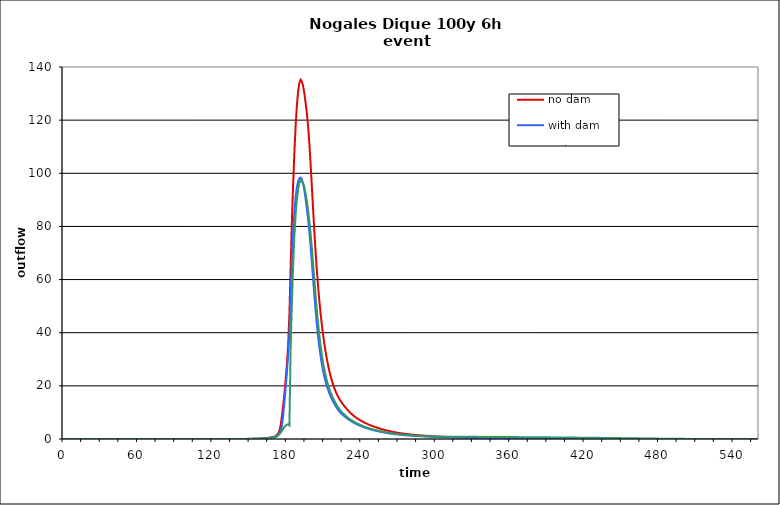
| Category | no dam | with dam | with dam/pond |
|---|---|---|---|
| 0.0 | 0 | 0 | 0 |
| 1.0 | 0 | 0 | 0 |
| 2.0 | 0 | 0 | 0 |
| 3.0 | 0 | 0 | 0 |
| 4.0 | 0 | 0 | 0 |
| 5.0 | 0 | 0 | 0 |
| 6.0 | 0 | 0 | 0 |
| 7.0 | 0 | 0 | 0 |
| 8.0 | 0 | 0 | 0 |
| 9.0 | 0 | 0 | 0 |
| 10.0 | 0 | 0 | 0 |
| 11.0 | 0 | 0 | 0 |
| 12.0 | 0 | 0 | 0 |
| 13.0 | 0 | 0 | 0 |
| 14.0 | 0 | 0 | 0 |
| 15.0 | 0 | 0 | 0 |
| 16.0 | 0 | 0 | 0 |
| 17.0 | 0 | 0 | 0 |
| 18.0 | 0 | 0 | 0 |
| 19.0 | 0 | 0 | 0 |
| 20.0 | 0 | 0 | 0 |
| 21.0 | 0 | 0 | 0 |
| 22.0 | 0 | 0 | 0 |
| 23.0 | 0 | 0 | 0 |
| 24.0 | 0 | 0 | 0 |
| 25.0 | 0 | 0 | 0 |
| 26.0 | 0 | 0 | 0 |
| 27.0 | 0 | 0 | 0 |
| 28.0 | 0 | 0 | 0 |
| 29.0 | 0 | 0 | 0 |
| 30.0 | 0 | 0 | 0 |
| 31.0 | 0 | 0 | 0 |
| 32.0 | 0 | 0 | 0 |
| 33.0 | 0 | 0 | 0 |
| 34.0 | 0 | 0 | 0 |
| 35.0 | 0 | 0 | 0 |
| 36.0 | 0 | 0 | 0 |
| 37.0 | 0 | 0 | 0 |
| 38.0 | 0 | 0 | 0 |
| 39.0 | 0 | 0 | 0 |
| 40.0 | 0 | 0 | 0 |
| 41.0 | 0 | 0 | 0 |
| 42.0 | 0 | 0 | 0 |
| 43.0 | 0 | 0 | 0 |
| 44.0 | 0 | 0 | 0 |
| 45.0 | 0 | 0 | 0 |
| 46.0 | 0 | 0 | 0 |
| 47.0 | 0 | 0 | 0 |
| 48.0 | 0 | 0 | 0 |
| 49.0 | 0 | 0 | 0 |
| 50.0 | 0 | 0 | 0 |
| 51.0 | 0 | 0 | 0 |
| 52.0 | 0 | 0 | 0 |
| 53.0 | 0 | 0 | 0 |
| 54.0 | 0 | 0 | 0 |
| 55.0 | 0 | 0 | 0 |
| 56.0 | 0 | 0 | 0 |
| 57.0 | 0 | 0 | 0 |
| 58.0 | 0 | 0 | 0 |
| 59.0 | 0 | 0 | 0 |
| 60.0 | 0 | 0 | 0 |
| 61.0 | 0 | 0 | 0 |
| 62.0 | 0 | 0 | 0 |
| 63.0 | 0 | 0 | 0 |
| 64.0 | 0 | 0 | 0 |
| 65.0 | 0 | 0 | 0 |
| 66.0 | 0 | 0 | 0 |
| 67.0 | 0 | 0 | 0 |
| 68.0 | 0 | 0 | 0 |
| 69.0 | 0 | 0 | 0 |
| 70.0 | 0 | 0 | 0 |
| 71.0 | 0 | 0 | 0 |
| 72.0 | 0 | 0 | 0 |
| 73.0 | 0 | 0 | 0 |
| 74.0 | 0 | 0 | 0 |
| 75.0 | 0 | 0 | 0 |
| 76.0 | 0 | 0 | 0 |
| 77.0 | 0 | 0 | 0 |
| 78.0 | 0 | 0 | 0 |
| 79.0 | 0 | 0 | 0 |
| 80.0 | 0 | 0 | 0 |
| 81.0 | 0 | 0 | 0 |
| 82.0 | 0 | 0 | 0 |
| 83.0 | 0 | 0 | 0 |
| 84.0 | 0 | 0 | 0 |
| 85.0 | 0 | 0 | 0 |
| 86.0 | 0 | 0 | 0 |
| 87.0 | 0 | 0 | 0 |
| 88.0 | 0 | 0 | 0 |
| 89.0 | 0 | 0 | 0 |
| 90.0 | 0 | 0 | 0 |
| 91.0 | 0 | 0 | 0 |
| 92.0 | 0 | 0 | 0 |
| 93.0 | 0 | 0 | 0 |
| 94.0 | 0 | 0 | 0 |
| 95.0 | 0 | 0 | 0 |
| 96.0 | 0 | 0 | 0 |
| 97.0 | 0 | 0 | 0 |
| 98.0 | 0 | 0 | 0 |
| 99.0 | 0 | 0 | 0 |
| 100.0 | 0 | 0 | 0 |
| 101.0 | 0 | 0 | 0 |
| 102.0 | 0 | 0 | 0 |
| 103.0 | 0 | 0 | 0 |
| 104.0 | 0 | 0 | 0 |
| 105.0 | 0 | 0 | 0 |
| 106.0 | 0 | 0 | 0 |
| 107.0 | 0 | 0 | 0 |
| 108.0 | 0 | 0 | 0 |
| 109.0 | 0 | 0 | 0 |
| 110.0 | 0 | 0 | 0 |
| 111.0 | 0 | 0 | 0 |
| 112.0 | 0 | 0 | 0 |
| 113.0 | 0 | 0 | 0 |
| 114.0 | 0 | 0 | 0 |
| 115.0 | 0 | 0 | 0 |
| 116.0 | 0 | 0 | 0 |
| 117.0 | 0 | 0 | 0 |
| 118.0 | 0 | 0 | 0 |
| 119.0 | 0 | 0 | 0 |
| 120.0 | 0 | 0 | 0 |
| 121.0 | 0 | 0 | 0 |
| 122.0 | 0 | 0 | 0 |
| 123.0 | 0 | 0 | 0 |
| 124.0 | 0 | 0 | 0 |
| 125.0 | 0 | 0 | 0 |
| 126.0 | 0 | 0 | 0 |
| 127.0 | 0.001 | 0 | 0 |
| 128.0 | 0.001 | 0 | 0 |
| 129.0 | 0.001 | 0 | 0 |
| 130.0 | 0.002 | 0 | 0 |
| 131.0 | 0.002 | 0 | 0 |
| 132.0 | 0.003 | 0.001 | 0.001 |
| 133.0 | 0.004 | 0.001 | 0.001 |
| 134.0 | 0.005 | 0.001 | 0.001 |
| 135.0 | 0.006 | 0.002 | 0.002 |
| 136.0 | 0.008 | 0.002 | 0.002 |
| 137.0 | 0.009 | 0.003 | 0.003 |
| 138.0 | 0.011 | 0.003 | 0.003 |
| 139.0 | 0.013 | 0.004 | 0.004 |
| 140.0 | 0.015 | 0.006 | 0.006 |
| 141.0 | 0.018 | 0.007 | 0.007 |
| 142.0 | 0.02 | 0.009 | 0.009 |
| 143.0 | 0.023 | 0.011 | 0.011 |
| 144.0 | 0.027 | 0.013 | 0.013 |
| 145.0 | 0.03 | 0.016 | 0.016 |
| 146.0 | 0.035 | 0.019 | 0.019 |
| 147.0 | 0.04 | 0.022 | 0.022 |
| 148.0 | 0.045 | 0.026 | 0.026 |
| 149.0 | 0.05 | 0.03 | 0.03 |
| 150.0 | 0.056 | 0.035 | 0.035 |
| 151.0 | 0.063 | 0.041 | 0.041 |
| 152.0 | 0.072 | 0.048 | 0.048 |
| 153.0 | 0.082 | 0.056 | 0.056 |
| 154.0 | 0.094 | 0.065 | 0.065 |
| 155.0 | 0.107 | 0.076 | 0.076 |
| 156.0 | 0.123 | 0.089 | 0.089 |
| 157.0 | 0.141 | 0.103 | 0.103 |
| 158.0 | 0.161 | 0.118 | 0.118 |
| 159.0 | 0.183 | 0.135 | 0.134 |
| 160.0 | 0.208 | 0.154 | 0.152 |
| 161.0 | 0.237 | 0.177 | 0.174 |
| 162.0 | 0.275 | 0.209 | 0.201 |
| 163.0 | 0.323 | 0.248 | 0.234 |
| 164.0 | 0.38 | 0.296 | 0.274 |
| 165.0 | 0.447 | 0.35 | 0.319 |
| 166.0 | 0.526 | 0.411 | 0.369 |
| 167.0 | 0.61 | 0.476 | 0.423 |
| 168.0 | 0.706 | 0.548 | 0.479 |
| 169.0 | 0.807 | 0.626 | 0.538 |
| 170.0 | 0.897 | 0.71 | 0.599 |
| 171.0 | 1.094 | 0.857 | 0.713 |
| 172.0 | 1.537 | 1.147 | 0.952 |
| 173.0 | 2.174 | 1.603 | 1.325 |
| 174.0 | 3.15 | 2.228 | 1.826 |
| 175.0 | 5.335 | 3.039 | 2.447 |
| 176.0 | 8.848 | 5.114 | 3.155 |
| 177.0 | 12.676 | 9.112 | 3.891 |
| 178.0 | 17.144 | 13.898 | 4.551 |
| 179.0 | 22.463 | 19.515 | 5.046 |
| 180.0 | 28.31 | 25.242 | 5.372 |
| 181.0 | 35.454 | 31.353 | 5.525 |
| 182.0 | 47.213 | 39.87 | 5.145 |
| 183.0 | 64.776 | 53.281 | 34.353 |
| 184.0 | 81.892 | 67.29 | 51.417 |
| 185.0 | 95.978 | 77.897 | 65.451 |
| 186.0 | 107.791 | 85.508 | 76.365 |
| 187.0 | 117.74 | 91.037 | 84.407 |
| 188.0 | 125.487 | 94.744 | 90.114 |
| 189.0 | 130.77 | 96.9 | 93.959 |
| 190.0 | 133.987 | 98.114 | 96.33 |
| 191.0 | 135.211 | 98.386 | 97.303 |
| 192.0 | 134.607 | 97.681 | 97.064 |
| 193.0 | 132.876 | 96.16 | 96.222 |
| 194.0 | 130.177 | 93.77 | 94.856 |
| 195.0 | 126.77 | 90.432 | 92.617 |
| 196.0 | 122.841 | 86.852 | 89.662 |
| 197.0 | 117.962 | 82.946 | 86.209 |
| 198.0 | 111.722 | 78.343 | 82.273 |
| 199.0 | 104.18 | 72.944 | 77.676 |
| 200.0 | 95.829 | 66.96 | 72.341 |
| 201.0 | 87.251 | 60.75 | 66.554 |
| 202.0 | 78.924 | 54.646 | 60.579 |
| 203.0 | 71.208 | 48.898 | 54.682 |
| 204.0 | 64.26 | 43.662 | 49.112 |
| 205.0 | 58.094 | 39.044 | 44.034 |
| 206.0 | 52.66 | 35.018 | 39.54 |
| 207.0 | 47.838 | 31.539 | 35.557 |
| 208.0 | 43.546 | 28.542 | 32.105 |
| 209.0 | 39.72 | 25.965 | 29.103 |
| 210.0 | 36.313 | 23.745 | 26.494 |
| 211.0 | 33.276 | 21.828 | 24.262 |
| 212.0 | 30.566 | 20.16 | 22.287 |
| 213.0 | 28.143 | 18.702 | 20.59 |
| 214.0 | 25.982 | 17.413 | 19.119 |
| 215.0 | 24.052 | 16.262 | 17.789 |
| 216.0 | 22.327 | 15.216 | 16.589 |
| 217.0 | 20.786 | 14.258 | 15.528 |
| 218.0 | 19.414 | 13.374 | 14.581 |
| 219.0 | 18.197 | 12.563 | 13.716 |
| 220.0 | 17.119 | 11.827 | 12.871 |
| 221.0 | 16.16 | 11.161 | 12.091 |
| 222.0 | 15.301 | 10.558 | 11.41 |
| 223.0 | 14.53 | 10.011 | 10.805 |
| 224.0 | 13.826 | 9.516 | 10.261 |
| 225.0 | 13.171 | 9.065 | 9.768 |
| 226.0 | 12.557 | 8.652 | 9.318 |
| 227.0 | 11.975 | 8.271 | 8.885 |
| 228.0 | 11.419 | 7.915 | 8.464 |
| 229.0 | 10.889 | 7.577 | 8.077 |
| 230.0 | 10.386 | 7.254 | 7.728 |
| 231.0 | 9.91 | 6.943 | 7.403 |
| 232.0 | 9.463 | 6.644 | 7.096 |
| 233.0 | 9.045 | 6.359 | 6.804 |
| 234.0 | 8.657 | 6.09 | 6.525 |
| 235.0 | 8.297 | 5.837 | 6.262 |
| 236.0 | 7.961 | 5.599 | 6.014 |
| 237.0 | 7.647 | 5.375 | 5.781 |
| 238.0 | 7.351 | 5.165 | 5.561 |
| 239.0 | 7.071 | 4.967 | 5.352 |
| 240.0 | 6.804 | 4.781 | 5.137 |
| 241.0 | 6.549 | 4.604 | 4.922 |
| 242.0 | 6.303 | 4.434 | 4.724 |
| 243.0 | 6.068 | 4.27 | 4.542 |
| 244.0 | 5.843 | 4.113 | 4.374 |
| 245.0 | 5.628 | 3.961 | 4.216 |
| 246.0 | 5.422 | 3.815 | 4.066 |
| 247.0 | 5.226 | 3.675 | 3.922 |
| 248.0 | 5.037 | 3.54 | 3.785 |
| 249.0 | 4.857 | 3.412 | 3.654 |
| 250.0 | 4.685 | 3.29 | 3.528 |
| 251.0 | 4.519 | 3.172 | 3.408 |
| 252.0 | 4.358 | 3.06 | 3.293 |
| 253.0 | 4.202 | 2.953 | 3.182 |
| 254.0 | 4.051 | 2.849 | 3.076 |
| 255.0 | 3.906 | 2.749 | 2.973 |
| 256.0 | 3.767 | 2.653 | 2.875 |
| 257.0 | 3.633 | 2.56 | 2.78 |
| 258.0 | 3.505 | 2.469 | 2.688 |
| 259.0 | 3.383 | 2.382 | 2.6 |
| 260.0 | 3.266 | 2.298 | 2.514 |
| 261.0 | 3.154 | 2.217 | 2.431 |
| 262.0 | 3.046 | 2.14 | 2.349 |
| 263.0 | 2.942 | 2.068 | 2.266 |
| 264.0 | 2.841 | 2 | 2.185 |
| 265.0 | 2.744 | 1.937 | 2.11 |
| 266.0 | 2.649 | 1.878 | 2.04 |
| 267.0 | 2.558 | 1.823 | 1.976 |
| 268.0 | 2.469 | 1.77 | 1.917 |
| 269.0 | 2.383 | 1.72 | 1.862 |
| 270.0 | 2.301 | 1.671 | 1.81 |
| 271.0 | 2.223 | 1.625 | 1.761 |
| 272.0 | 2.15 | 1.58 | 1.714 |
| 273.0 | 2.081 | 1.537 | 1.668 |
| 274.0 | 2.015 | 1.495 | 1.625 |
| 275.0 | 1.954 | 1.454 | 1.582 |
| 276.0 | 1.895 | 1.415 | 1.542 |
| 277.0 | 1.839 | 1.378 | 1.503 |
| 278.0 | 1.785 | 1.342 | 1.465 |
| 279.0 | 1.734 | 1.307 | 1.428 |
| 280.0 | 1.685 | 1.274 | 1.393 |
| 281.0 | 1.637 | 1.242 | 1.36 |
| 282.0 | 1.591 | 1.21 | 1.327 |
| 283.0 | 1.547 | 1.18 | 1.295 |
| 284.0 | 1.504 | 1.151 | 1.265 |
| 285.0 | 1.463 | 1.123 | 1.235 |
| 286.0 | 1.423 | 1.095 | 1.206 |
| 287.0 | 1.385 | 1.068 | 1.178 |
| 288.0 | 1.348 | 1.042 | 1.151 |
| 289.0 | 1.312 | 1.016 | 1.125 |
| 290.0 | 1.278 | 0.991 | 1.099 |
| 291.0 | 1.245 | 0.967 | 1.074 |
| 292.0 | 1.212 | 0.944 | 1.05 |
| 293.0 | 1.181 | 0.922 | 1.026 |
| 294.0 | 1.151 | 0.9 | 1.003 |
| 295.0 | 1.121 | 0.879 | 0.981 |
| 296.0 | 1.093 | 0.859 | 0.96 |
| 297.0 | 1.065 | 0.84 | 0.939 |
| 298.0 | 1.038 | 0.821 | 0.92 |
| 299.0 | 1.012 | 0.802 | 0.903 |
| 300.0 | 0.986 | 0.784 | 0.89 |
| 301.0 | 0.962 | 0.767 | 0.881 |
| 302.0 | 0.938 | 0.75 | 0.875 |
| 303.0 | 0.915 | 0.733 | 0.872 |
| 304.0 | 0.893 | 0.717 | 0.87 |
| 305.0 | 0.871 | 0.702 | 0.868 |
| 306.0 | 0.85 | 0.687 | 0.866 |
| 307.0 | 0.829 | 0.672 | 0.864 |
| 308.0 | 0.809 | 0.658 | 0.862 |
| 309.0 | 0.79 | 0.645 | 0.86 |
| 310.0 | 0.771 | 0.631 | 0.858 |
| 311.0 | 0.753 | 0.618 | 0.856 |
| 312.0 | 0.735 | 0.606 | 0.854 |
| 313.0 | 0.717 | 0.593 | 0.852 |
| 314.0 | 0.7 | 0.581 | 0.85 |
| 315.0 | 0.683 | 0.569 | 0.848 |
| 316.0 | 0.667 | 0.558 | 0.845 |
| 317.0 | 0.652 | 0.546 | 0.843 |
| 318.0 | 0.636 | 0.535 | 0.841 |
| 319.0 | 0.622 | 0.525 | 0.838 |
| 320.0 | 0.607 | 0.514 | 0.836 |
| 321.0 | 0.593 | 0.504 | 0.834 |
| 322.0 | 0.579 | 0.494 | 0.831 |
| 323.0 | 0.566 | 0.484 | 0.829 |
| 324.0 | 0.553 | 0.475 | 0.826 |
| 325.0 | 0.54 | 0.465 | 0.824 |
| 326.0 | 0.528 | 0.456 | 0.821 |
| 327.0 | 0.516 | 0.447 | 0.819 |
| 328.0 | 0.504 | 0.438 | 0.816 |
| 329.0 | 0.492 | 0.43 | 0.814 |
| 330.0 | 0.481 | 0.421 | 0.811 |
| 331.0 | 0.47 | 0.413 | 0.809 |
| 332.0 | 0.459 | 0.405 | 0.806 |
| 333.0 | 0.449 | 0.397 | 0.803 |
| 334.0 | 0.438 | 0.389 | 0.801 |
| 335.0 | 0.428 | 0.381 | 0.798 |
| 336.0 | 0.418 | 0.373 | 0.795 |
| 337.0 | 0.409 | 0.366 | 0.792 |
| 338.0 | 0.399 | 0.359 | 0.79 |
| 339.0 | 0.39 | 0.352 | 0.787 |
| 340.0 | 0.381 | 0.345 | 0.784 |
| 341.0 | 0.373 | 0.338 | 0.781 |
| 342.0 | 0.364 | 0.332 | 0.778 |
| 343.0 | 0.356 | 0.325 | 0.776 |
| 344.0 | 0.348 | 0.319 | 0.773 |
| 345.0 | 0.34 | 0.313 | 0.77 |
| 346.0 | 0.332 | 0.307 | 0.767 |
| 347.0 | 0.324 | 0.301 | 0.764 |
| 348.0 | 0.317 | 0.295 | 0.761 |
| 349.0 | 0.31 | 0.29 | 0.758 |
| 350.0 | 0.303 | 0.284 | 0.755 |
| 351.0 | 0.296 | 0.279 | 0.752 |
| 352.0 | 0.289 | 0.274 | 0.749 |
| 353.0 | 0.283 | 0.269 | 0.746 |
| 354.0 | 0.276 | 0.264 | 0.743 |
| 355.0 | 0.27 | 0.259 | 0.74 |
| 356.0 | 0.264 | 0.254 | 0.737 |
| 357.0 | 0.258 | 0.249 | 0.734 |
| 358.0 | 0.252 | 0.245 | 0.731 |
| 359.0 | 0.246 | 0.24 | 0.728 |
| 360.0 | 0.241 | 0.236 | 0.725 |
| 361.0 | 0.236 | 0.232 | 0.722 |
| 362.0 | 0.23 | 0.227 | 0.719 |
| 363.0 | 0.225 | 0.223 | 0.715 |
| 364.0 | 0.22 | 0.219 | 0.712 |
| 365.0 | 0.215 | 0.215 | 0.709 |
| 366.0 | 0.21 | 0.212 | 0.706 |
| 367.0 | 0.206 | 0.208 | 0.703 |
| 368.0 | 0.201 | 0.204 | 0.7 |
| 369.0 | 0.196 | 0.2 | 0.697 |
| 370.0 | 0.192 | 0.197 | 0.694 |
| 371.0 | 0.188 | 0.193 | 0.691 |
| 372.0 | 0.183 | 0.19 | 0.688 |
| 373.0 | 0.179 | 0.186 | 0.684 |
| 374.0 | 0.175 | 0.183 | 0.681 |
| 375.0 | 0.171 | 0.18 | 0.678 |
| 376.0 | 0.167 | 0.177 | 0.675 |
| 377.0 | 0.164 | 0.174 | 0.672 |
| 378.0 | 0.16 | 0.17 | 0.668 |
| 379.0 | 0.156 | 0.167 | 0.665 |
| 380.0 | 0.153 | 0.165 | 0.662 |
| 381.0 | 0.15 | 0.162 | 0.658 |
| 382.0 | 0.146 | 0.159 | 0.654 |
| 383.0 | 0.143 | 0.156 | 0.651 |
| 384.0 | 0.14 | 0.153 | 0.647 |
| 385.0 | 0.137 | 0.151 | 0.643 |
| 386.0 | 0.134 | 0.148 | 0.639 |
| 387.0 | 0.131 | 0.146 | 0.634 |
| 388.0 | 0.128 | 0.143 | 0.63 |
| 389.0 | 0.126 | 0.141 | 0.626 |
| 390.0 | 0.123 | 0.139 | 0.622 |
| 391.0 | 0.12 | 0.137 | 0.618 |
| 392.0 | 0.118 | 0.134 | 0.614 |
| 393.0 | 0.115 | 0.132 | 0.609 |
| 394.0 | 0.113 | 0.13 | 0.605 |
| 395.0 | 0.11 | 0.128 | 0.601 |
| 396.0 | 0.108 | 0.126 | 0.596 |
| 397.0 | 0.106 | 0.124 | 0.592 |
| 398.0 | 0.104 | 0.122 | 0.588 |
| 399.0 | 0.101 | 0.12 | 0.583 |
| 400.0 | 0.099 | 0.119 | 0.579 |
| 401.0 | 0.097 | 0.117 | 0.574 |
| 402.0 | 0.095 | 0.115 | 0.57 |
| 403.0 | 0.093 | 0.113 | 0.566 |
| 404.0 | 0.091 | 0.112 | 0.561 |
| 405.0 | 0.089 | 0.11 | 0.557 |
| 406.0 | 0.088 | 0.109 | 0.552 |
| 407.0 | 0.086 | 0.107 | 0.548 |
| 408.0 | 0.084 | 0.106 | 0.543 |
| 409.0 | 0.082 | 0.104 | 0.539 |
| 410.0 | 0.081 | 0.103 | 0.534 |
| 411.0 | 0.079 | 0.101 | 0.529 |
| 412.0 | 0.077 | 0.1 | 0.525 |
| 413.0 | 0.076 | 0.098 | 0.52 |
| 414.0 | 0.074 | 0.097 | 0.516 |
| 415.0 | 0.073 | 0.096 | 0.511 |
| 416.0 | 0.071 | 0.094 | 0.506 |
| 417.0 | 0.07 | 0.093 | 0.501 |
| 418.0 | 0.068 | 0.092 | 0.497 |
| 419.0 | 0.067 | 0.09 | 0.492 |
| 420.0 | 0.066 | 0.089 | 0.487 |
| 421.0 | 0.064 | 0.088 | 0.482 |
| 422.0 | 0.063 | 0.087 | 0.477 |
| 423.0 | 0.062 | 0.086 | 0.472 |
| 424.0 | 0.06 | 0.084 | 0.467 |
| 425.0 | 0.059 | 0.083 | 0.462 |
| 426.0 | 0.058 | 0.082 | 0.456 |
| 427.0 | 0.057 | 0.081 | 0.451 |
| 428.0 | 0.056 | 0.079 | 0.446 |
| 429.0 | 0.055 | 0.078 | 0.441 |
| 430.0 | 0.054 | 0.077 | 0.435 |
| 431.0 | 0.052 | 0.075 | 0.43 |
| 432.0 | 0.051 | 0.074 | 0.424 |
| 433.0 | 0.05 | 0.072 | 0.419 |
| 434.0 | 0.049 | 0.071 | 0.413 |
| 435.0 | 0.048 | 0.069 | 0.408 |
| 436.0 | 0.047 | 0.068 | 0.402 |
| 437.0 | 0.046 | 0.066 | 0.397 |
| 438.0 | 0.046 | 0.065 | 0.391 |
| 439.0 | 0.045 | 0.063 | 0.385 |
| 440.0 | 0.044 | 0.061 | 0.38 |
| 441.0 | 0.043 | 0.06 | 0.374 |
| 442.0 | 0.042 | 0.058 | 0.369 |
| 443.0 | 0.041 | 0.057 | 0.363 |
| 444.0 | 0.04 | 0.055 | 0.357 |
| 445.0 | 0.039 | 0.054 | 0.351 |
| 446.0 | 0.038 | 0.052 | 0.345 |
| 447.0 | 0.037 | 0.051 | 0.34 |
| 448.0 | 0.036 | 0.049 | 0.334 |
| 449.0 | 0.036 | 0.048 | 0.328 |
| 450.0 | 0.035 | 0.046 | 0.322 |
| 451.0 | 0.034 | 0.045 | 0.316 |
| 452.0 | 0.033 | 0.044 | 0.31 |
| 453.0 | 0.032 | 0.043 | 0.304 |
| 454.0 | 0.031 | 0.041 | 0.298 |
| 455.0 | 0.031 | 0.04 | 0.292 |
| 456.0 | 0.03 | 0.039 | 0.285 |
| 457.0 | 0.029 | 0.038 | 0.279 |
| 458.0 | 0.028 | 0.037 | 0.273 |
| 459.0 | 0.027 | 0.036 | 0.266 |
| 460.0 | 0.027 | 0.035 | 0.26 |
| 461.0 | 0.026 | 0.034 | 0.254 |
| 462.0 | 0.025 | 0.033 | 0.248 |
| 463.0 | 0.024 | 0.032 | 0.241 |
| 464.0 | 0.024 | 0.031 | 0.235 |
| 465.0 | 0.023 | 0.03 | 0.229 |
| 466.0 | 0.022 | 0.03 | 0.223 |
| 467.0 | 0.022 | 0.029 | 0.217 |
| 468.0 | 0.021 | 0.028 | 0.211 |
| 469.0 | 0.021 | 0.027 | 0.205 |
| 470.0 | 0.02 | 0.027 | 0.199 |
| 471.0 | 0.02 | 0.026 | 0.193 |
| 472.0 | 0.019 | 0.025 | 0.187 |
| 473.0 | 0.018 | 0.025 | 0.181 |
| 474.0 | 0.018 | 0.024 | 0.175 |
| 475.0 | 0.017 | 0.023 | 0.17 |
| 476.0 | 0.017 | 0.023 | 0.164 |
| 477.0 | 0.016 | 0.022 | 0.158 |
| 478.0 | 0.016 | 0.022 | 0.152 |
| 479.0 | 0.015 | 0.021 | 0.145 |
| 480.0 | 0.015 | 0.021 | 0.139 |
| 481.0 | 0.014 | 0.02 | 0.132 |
| 482.0 | 0.014 | 0.02 | 0.126 |
| 483.0 | 0.014 | 0.019 | 0.119 |
| 484.0 | 0.013 | 0.019 | 0.113 |
| 485.0 | 0.013 | 0.018 | 0.107 |
| 486.0 | 0.012 | 0.018 | 0.101 |
| 487.0 | 0.012 | 0.018 | 0.096 |
| 488.0 | 0.011 | 0.017 | 0.091 |
| 489.0 | 0.011 | 0.017 | 0.086 |
| 490.0 | 0.011 | 0.017 | 0.081 |
| 491.0 | 0.01 | 0.016 | 0.077 |
| 492.0 | 0.01 | 0.016 | 0.073 |
| 493.0 | 0.01 | 0.016 | 0.069 |
| 494.0 | 0.009 | 0.015 | 0.065 |
| 495.0 | 0.009 | 0.015 | 0.062 |
| 496.0 | 0.008 | 0.015 | 0.059 |
| 497.0 | 0.008 | 0.014 | 0.056 |
| 498.0 | 0.008 | 0.014 | 0.053 |
| 499.0 | 0.007 | 0.014 | 0.051 |
| 500.0 | 0.007 | 0.014 | 0.048 |
| 501.0 | 0.007 | 0.014 | 0.046 |
| 502.0 | 0.006 | 0.013 | 0.044 |
| 503.0 | 0.006 | 0.013 | 0.042 |
| 504.0 | 0.006 | 0.013 | 0.04 |
| 505.0 | 0.006 | 0.013 | 0.038 |
| 506.0 | 0.005 | 0.012 | 0.037 |
| 507.0 | 0.005 | 0.012 | 0.035 |
| 508.0 | 0.005 | 0.012 | 0.034 |
| 509.0 | 0.004 | 0.012 | 0.032 |
| 510.0 | 0.004 | 0.012 | 0.031 |
| 511.0 | 0.004 | 0.012 | 0.03 |
| 512.0 | 0.004 | 0.011 | 0.028 |
| 513.0 | 0.004 | 0.011 | 0.027 |
| 514.0 | 0.003 | 0.011 | 0.026 |
| 515.0 | 0.003 | 0.011 | 0.025 |
| 516.0 | 0.003 | 0.011 | 0.024 |
| 517.0 | 0.003 | 0.011 | 0.023 |
| 518.0 | 0.002 | 0.011 | 0.023 |
| 519.0 | 0.002 | 0.011 | 0.022 |
| 520.0 | 0.002 | 0.01 | 0.021 |
| 521.0 | 0.002 | 0.01 | 0.02 |
| 522.0 | 0.002 | 0.01 | 0.02 |
| 523.0 | 0.002 | 0.01 | 0.019 |
| 524.0 | 0.001 | 0.01 | 0.019 |
| 525.0 | 0.001 | 0.01 | 0.018 |
| 526.0 | 0.001 | 0.01 | 0.017 |
| 527.0 | 0.001 | 0.01 | 0.017 |
| 528.0 | 0.001 | 0.01 | 0.017 |
| 529.0 | 0.001 | 0.01 | 0.016 |
| 530.0 | 0.001 | 0.01 | 0.016 |
| 531.0 | 0.001 | 0.01 | 0.015 |
| 532.0 | 0.001 | 0.01 | 0.015 |
| 533.0 | 0.001 | 0.01 | 0.015 |
| 534.0 | 0 | 0.01 | 0.014 |
| 535.0 | 0 | 0.01 | 0.014 |
| 536.0 | 0 | 0.01 | 0.014 |
| 537.0 | 0 | 0.009 | 0.013 |
| 538.0 | 0 | 0.009 | 0.013 |
| 539.0 | 0 | 0.009 | 0.013 |
| 540.0 | 0 | 0.009 | 0.013 |
| 541.0 | 0 | 0.009 | 0.012 |
| 542.0 | 0 | 0.009 | 0.012 |
| 543.0 | 0 | 0.009 | 0.012 |
| 544.0 | 0 | 0.009 | 0.012 |
| 545.0 | 0 | 0.009 | 0.012 |
| 546.0 | 0 | 0.009 | 0.011 |
| 547.0 | 0 | 0.009 | 0.011 |
| 548.0 | 0 | 0.009 | 0.011 |
| 549.0 | 0 | 0.009 | 0.011 |
| 550.0 | 0 | 0.009 | 0.011 |
| 551.0 | 0 | 0.009 | 0.011 |
| 552.0 | 0 | 0.009 | 0.011 |
| 553.0 | 0 | 0.009 | 0.01 |
| 554.0 | 0 | 0.009 | 0.01 |
| 555.0 | 0 | 0.009 | 0.01 |
| 556.0 | 0 | 0.009 | 0.01 |
| 557.0 | 0 | 0.009 | 0.01 |
| 558.0 | 0 | 0.009 | 0.01 |
| 559.0 | 0 | 0.009 | 0.01 |
| 560.0 | 0 | 0.009 | 0.01 |